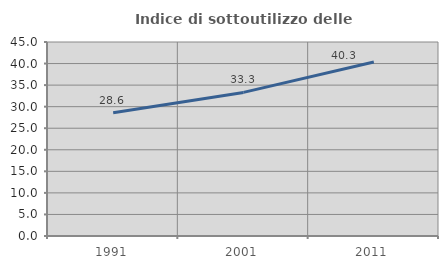
| Category | Indice di sottoutilizzo delle abitazioni  |
|---|---|
| 1991.0 | 28.608 |
| 2001.0 | 33.307 |
| 2011.0 | 40.348 |